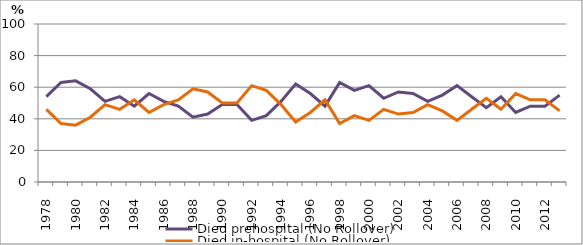
| Category | Died prehospital (No Rollover) | Died in-hospital (No Rollover) |
|---|---|---|
| 1978.0 | 54 | 46 |
| 1979.0 | 63 | 37 |
| 1980.0 | 64 | 36 |
| 1981.0 | 59 | 41 |
| 1982.0 | 51 | 49 |
| 1983.0 | 54 | 46 |
| 1984.0 | 48 | 52 |
| 1985.0 | 56 | 44 |
| 1986.0 | 51 | 49 |
| 1987.0 | 48 | 52 |
| 1988.0 | 41 | 59 |
| 1989.0 | 43 | 57 |
| 1990.0 | 49 | 50 |
| 1991.0 | 49 | 50 |
| 1992.0 | 39 | 61 |
| 1993.0 | 42 | 58 |
| 1994.0 | 51 | 49 |
| 1995.0 | 62 | 38 |
| 1996.0 | 56 | 44 |
| 1997.0 | 48 | 52 |
| 1998.0 | 63 | 37 |
| 1999.0 | 58 | 42 |
| 2000.0 | 61 | 39 |
| 2001.0 | 53 | 46 |
| 2002.0 | 57 | 43 |
| 2003.0 | 56 | 44 |
| 2004.0 | 51 | 49 |
| 2005.0 | 55 | 45 |
| 2006.0 | 61 | 39 |
| 2007.0 | 54 | 46 |
| 2008.0 | 47 | 53 |
| 2009.0 | 54 | 46 |
| 2010.0 | 44 | 56 |
| 2011.0 | 48 | 52 |
| 2012.0 | 48 | 52 |
| 2013.0 | 55 | 45 |